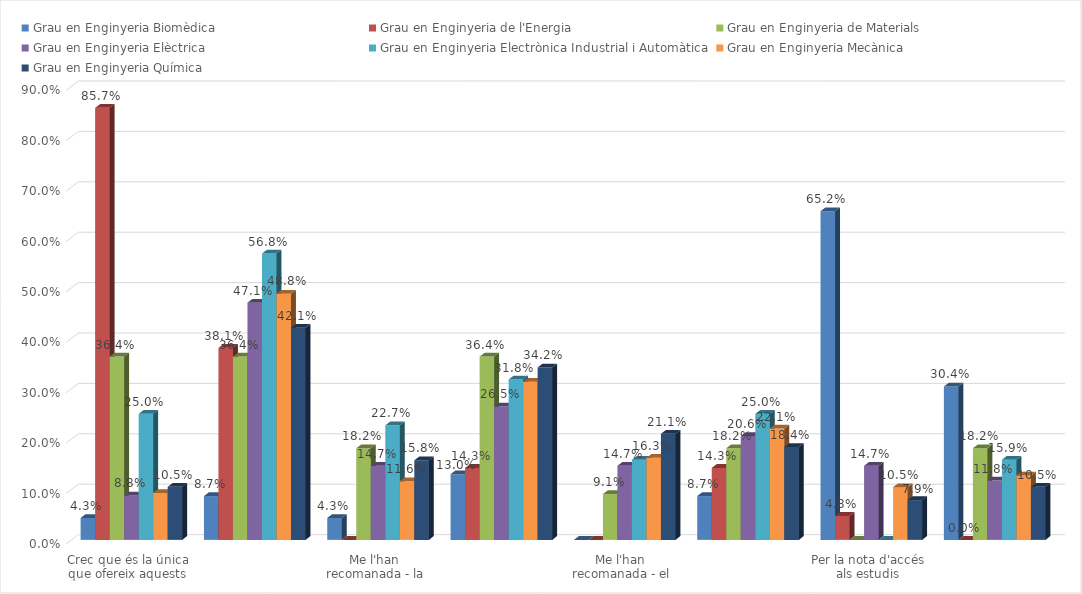
| Category | Grau en Enginyeria Biomèdica | Grau en Enginyeria de l'Energia | Grau en Enginyeria de Materials | Grau en Enginyeria Elèctrica | Grau en Enginyeria Electrònica Industrial i Automàtica | Grau en Enginyeria Mecànica | Grau en Enginyeria Química |
|---|---|---|---|---|---|---|---|
| Crec que és la única que ofereix aquests estudis | 0.043 | 0.857 | 0.364 | 0.088 | 0.25 | 0.093 | 0.105 |
| Per què és una universitat pública | 0.087 | 0.381 | 0.364 | 0.471 | 0.568 | 0.488 | 0.421 |
| Me l'han recomanada - la família | 0.043 | 0 | 0.182 | 0.147 | 0.227 | 0.116 | 0.158 |
| Me l'han recomanada - estudiants o antics estudiants de la UPC | 0.13 | 0.143 | 0.364 | 0.265 | 0.318 | 0.314 | 0.342 |
| Me l'han recomanada - el professorat | 0 | 0 | 0.091 | 0.147 | 0.159 | 0.163 | 0.211 |
| Per la facilitat d'accés (proximitat, bona comunicació ...) | 0.087 | 0.143 | 0.182 | 0.206 | 0.25 | 0.221 | 0.184 |
| Per la nota d'accés als estudis | 0.652 | 0.048 | 0 | 0.147 | 0 | 0.105 | 0.079 |
| Altres | 0.304 | 0 | 0.182 | 0.118 | 0.159 | 0.128 | 0.105 |